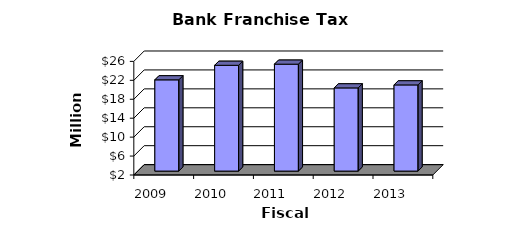
| Category | Series 0 |
|---|---|
| 2009.0 | 21273000 |
| 2010.0 | 24343000 |
| 2011.0 | 24580000 |
| 2012.0 | 19570000 |
| 2013.0 | 20202000 |